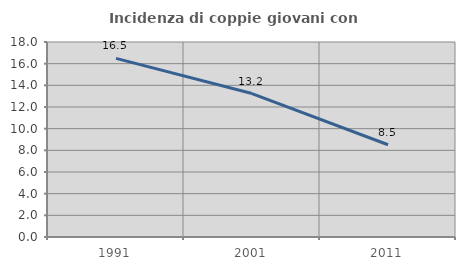
| Category | Incidenza di coppie giovani con figli |
|---|---|
| 1991.0 | 16.488 |
| 2001.0 | 13.243 |
| 2011.0 | 8.514 |